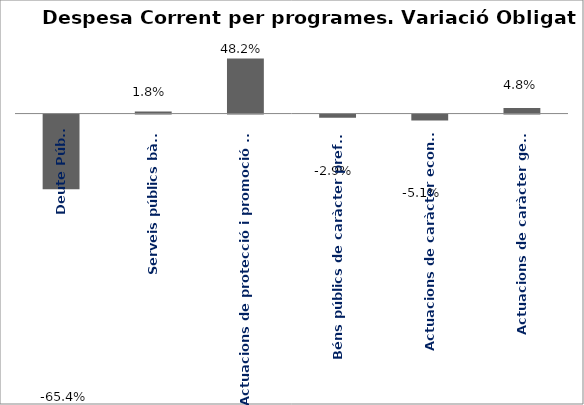
| Category | Series 0 |
|---|---|
| Deute Públic | -0.654 |
| Serveis públics bàsics | 0.018 |
| Actuacions de protecció i promoció social | 0.482 |
| Béns públics de caràcter preferent | -0.029 |
| Actuacions de caràcter econòmic | -0.051 |
| Actuacions de caràcter general | 0.048 |